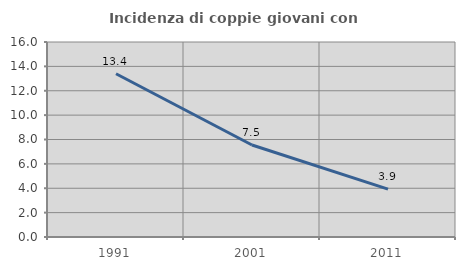
| Category | Incidenza di coppie giovani con figli |
|---|---|
| 1991.0 | 13.393 |
| 2001.0 | 7.547 |
| 2011.0 | 3.933 |